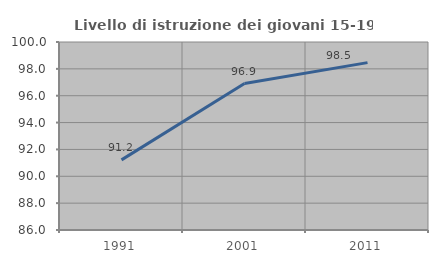
| Category | Livello di istruzione dei giovani 15-19 anni |
|---|---|
| 1991.0 | 91.222 |
| 2001.0 | 96.904 |
| 2011.0 | 98.464 |